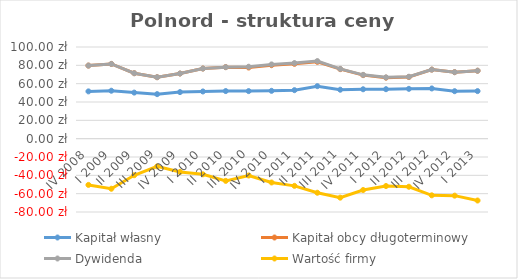
| Category | Kapitał własny | Kapitał obcy długoterminowy | Dywidenda | Wartość firmy |
|---|---|---|---|---|
| IV 2008 | 51.576 | 28.153 | 0 | -50.439 |
| I 2009 | 52.298 | 29.238 | 0 | -54.636 |
| II 2009 | 50.267 | 21.14 | 0 | -39.906 |
| III 2009 | 48.572 | 18.477 | 0 | -30.218 |
| IV 2009 | 50.797 | 20.247 | 0 | -36.293 |
| I 2010 | 51.482 | 25.029 | 0 | -38.9 |
| II 2010 | 51.93 | 26.098 | 0 | -46.029 |
| III 2010 | 51.889 | 25.717 | 0.86 | -40.186 |
| IV 2010 | 52.183 | 27.957 | 0.86 | -47.8 |
| I 2011 | 52.912 | 28.706 | 0.86 | -51.478 |
| II 2011 | 57.271 | 26.507 | 0.86 | -58.988 |
| III 2011 | 53.401 | 22.428 | 0.32 | -64.35 |
| IV 2011 | 53.89 | 15.41 | 0.32 | -56.019 |
| I 2012 | 53.971 | 12.584 | 0.32 | -51.675 |
| II 2012 | 54.345 | 12.881 | 0.32 | -52.446 |
| III 2012 | 54.776 | 20.544 | 0 | -61.82 |
| IV 2012 | 51.797 | 20.758 | 0 | -62.155 |
| I 2013 | 51.887 | 22.233 | 0 | -67.47 |